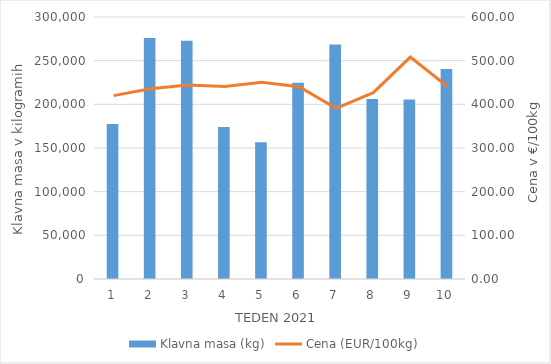
| Category | Klavna masa (kg) |
|---|---|
| 1.0 | 177573 |
| 2.0 | 275951 |
| 3.0 | 272797 |
| 4.0 | 174056 |
| 5.0 | 156508 |
| 6.0 | 224595 |
| 7.0 | 268436 |
| 8.0 | 206193 |
| 9.0 | 205669 |
| 10.0 | 240592 |